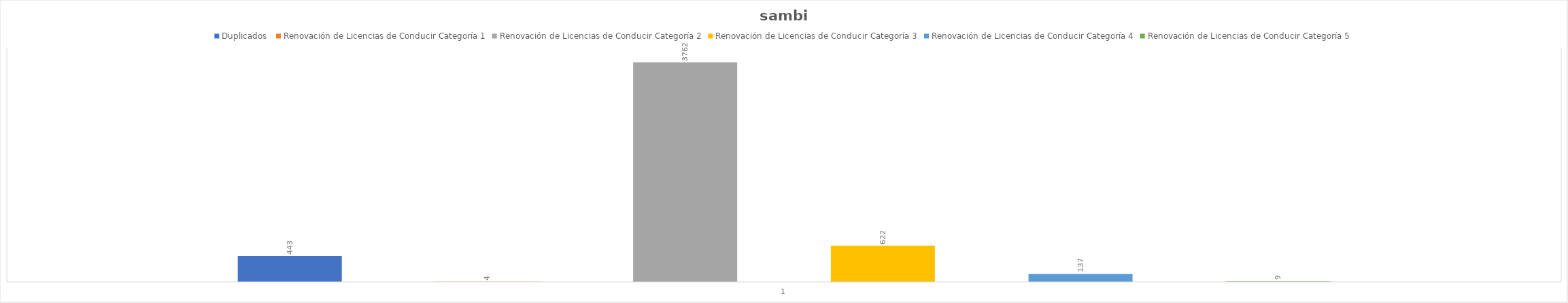
| Category | Duplicados  | Renovación de Licencias de Conducir Categoría 1 | Renovación de Licencias de Conducir Categoría 2 | Renovación de Licencias de Conducir Categoría 3 | Renovación de Licencias de Conducir Categoría 4 | Renovación de Licencias de Conducir Categoría 5 |
|---|---|---|---|---|---|---|
| 0 | 443 | 4 | 3762 | 622 | 137 | 9 |